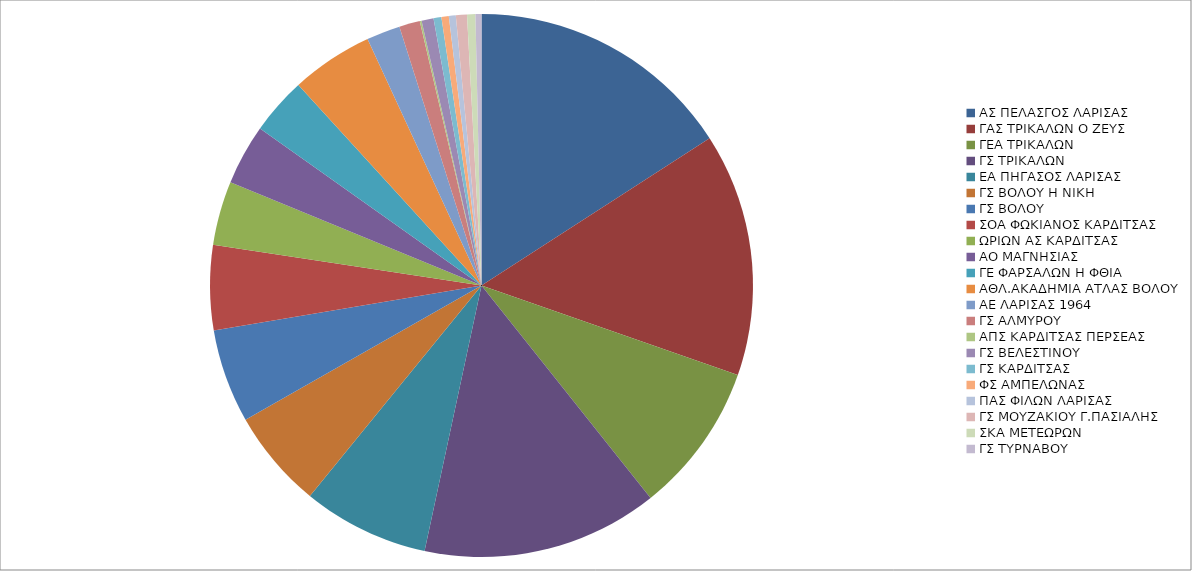
| Category | ΒΑΘΜΟΙ |
|---|---|
| ΑΣ ΠΕΛΑΣΓΟΣ ΛΑΡΙΣΑΣ | 578 |
| ΓΑΣ ΤΡΙΚΑΛΩΝ Ο ΖΕΥΣ | 527 |
| ΓΕΑ ΤΡΙΚΑΛΩΝ | 326 |
| ΓΣ ΤΡΙΚΑΛΩΝ | 512 |
| ΕΑ ΠΗΓΑΣΟΣ ΛΑΡΙΣΑΣ | 274 |
| ΓΣ ΒΟΛΟΥ Η ΝΙΚΗ | 214 |
| ΓΣ ΒΟΛΟΥ | 203 |
| ΣΟΑ ΦΩΚΙΑΝΟΣ ΚΑΡΔΙΤΣΑΣ | 184 |
| ΩΡΙΩΝ ΑΣ ΚΑΡΔΙΤΣΑΣ | 139 |
| ΑΟ ΜΑΓΝΗΣΙΑΣ | 131 |
| ΓΕ ΦΑΡΣΑΛΩΝ Η ΦΘΙΑ | 124 |
| ΑΘΛ.ΑΚΑΔΗΜΙΑ ΑΤΛΑΣ ΒΟΛΟΥ | 178 |
| ΑΕ ΛΑΡΙΣΑΣ 1964 | 73 |
| ΓΣ ΑΛΜΥΡΟΥ | 45 |
| ΑΠΣ ΚΑΡΔΙΤΣΑΣ ΠΕΡΣΕΑΣ | 4 |
| ΓΣ ΒΕΛΕΣΤΙΝΟΥ | 26 |
| ΓΣ ΚΑΡΔΙΤΣΑΣ | 17 |
| ΦΣ ΑΜΠΕΛΩΝΑΣ | 16 |
| ΠΑΣ ΦΙΛΩΝ ΛΑΡΙΣΑΣ | 15 |
| ΓΣ ΜΟΥΖΑΚΙΟΥ Γ.ΠΑΣΙΑΛΗΣ | 24 |
| ΣΚΑ ΜΕΤΕΩΡΩΝ | 18 |
| ΓΣ ΤΥΡΝΑΒΟΥ | 13 |